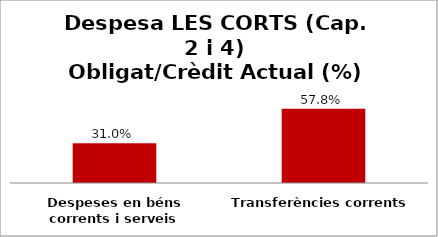
| Category | Series 0 |
|---|---|
| Despeses en béns corrents i serveis | 0.31 |
| Transferències corrents | 0.578 |